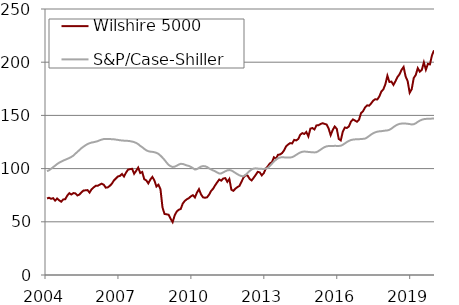
| Category | Wilshire 5000 | S&P/Case-Shiller Index |
|---|---|---|
| 2004.0 | 71.941 | 97.501 |
| 2004.0 | 72.587 | 98.418 |
| 2004.0 | 71.601 | 99.839 |
| 2004.0 | 72.224 | 101.294 |
| 2004.0 | 69.923 | 102.787 |
| 2004.0 | 71.889 | 104.3 |
| 2004.0 | 70.207 | 105.561 |
| 2004.0 | 68.888 | 106.584 |
| 2004.0 | 71.003 | 107.481 |
| 2004.0 | 71.267 | 108.306 |
| 2004.0 | 74.633 | 109.136 |
| 2004.0 | 76.897 | 109.949 |
| 2005.0 | 75.619 | 110.961 |
| 2005.0 | 76.978 | 112.204 |
| 2005.0 | 76.733 | 114.042 |
| 2005.0 | 74.734 | 115.721 |
| 2005.0 | 75.647 | 117.484 |
| 2005.0 | 77.666 | 119.197 |
| 2005.0 | 79.436 | 120.64 |
| 2005.0 | 79.562 | 121.905 |
| 2005.0 | 79.785 | 123.074 |
| 2005.0 | 77.477 | 123.864 |
| 2005.0 | 80.553 | 124.503 |
| 2005.0 | 82.276 | 124.804 |
| 2006.0 | 83.772 | 125.304 |
| 2006.0 | 83.796 | 125.769 |
| 2006.0 | 84.947 | 126.635 |
| 2006.0 | 85.831 | 127.258 |
| 2006.0 | 84.875 | 127.765 |
| 2006.0 | 82.088 | 127.881 |
| 2006.0 | 82.374 | 127.922 |
| 2006.0 | 83.797 | 127.781 |
| 2006.0 | 85.784 | 127.639 |
| 2006.0 | 88.804 | 127.539 |
| 2006.0 | 90.71 | 127.247 |
| 2006.0 | 92.617 | 126.968 |
| 2007.0 | 93.134 | 126.614 |
| 2007.0 | 94.961 | 126.443 |
| 2007.0 | 92.525 | 126.25 |
| 2007.0 | 96.251 | 126.206 |
| 2007.0 | 99.072 | 126.035 |
| 2007.0 | 99.469 | 125.797 |
| 2007.0 | 99.834 | 125.418 |
| 2007.0 | 95.13 | 124.892 |
| 2007.0 | 97.895 | 124.121 |
| 2007.0 | 100.939 | 123.017 |
| 2007.0 | 95.877 | 121.377 |
| 2007.0 | 96.811 | 120.113 |
| 2008.0 | 89.999 | 118.547 |
| 2008.0 | 88.917 | 117.24 |
| 2008.0 | 86.123 | 116.349 |
| 2008.0 | 89.722 | 115.947 |
| 2008.0 | 92.182 | 115.737 |
| 2008.0 | 88.888 | 115.401 |
| 2008.0 | 83.152 | 114.83 |
| 2008.0 | 84.871 | 113.835 |
| 2008.0 | 80.628 | 112.196 |
| 2008.0 | 63.464 | 110.291 |
| 2008.0 | 57.38 | 108.148 |
| 2008.0 | 57.032 | 105.705 |
| 2009.0 | 56.688 | 103.499 |
| 2009.0 | 52.829 | 102.291 |
| 2009.0 | 49.665 | 101.527 |
| 2009.0 | 55.95 | 101.823 |
| 2009.0 | 59.614 | 102.673 |
| 2009.0 | 61.289 | 103.801 |
| 2009.0 | 62.023 | 104.46 |
| 2009.0 | 67.153 | 104.404 |
| 2009.0 | 69.65 | 103.682 |
| 2009.0 | 71.159 | 102.96 |
| 2009.0 | 72.206 | 102.513 |
| 2009.0 | 73.916 | 101.63 |
| 2010.0 | 75.04 | 100.479 |
| 2010.0 | 72.868 | 99.128 |
| 2010.0 | 77.409 | 99.505 |
| 2010.0 | 80.683 | 100.756 |
| 2010.0 | 75.869 | 101.89 |
| 2010.0 | 73.011 | 102.35 |
| 2010.0 | 72.57 | 102.253 |
| 2010.0 | 73.023 | 101.466 |
| 2010.0 | 75.502 | 100.206 |
| 2010.0 | 79.03 | 99.182 |
| 2010.0 | 81.126 | 98.275 |
| 2010.0 | 84.349 | 97.45 |
| 2011.0 | 87.107 | 96.348 |
| 2011.0 | 89.741 | 95.443 |
| 2011.0 | 88.689 | 95.48 |
| 2011.0 | 90.707 | 96.429 |
| 2011.0 | 91.015 | 97.492 |
| 2011.0 | 87.54 | 98.359 |
| 2011.0 | 90.235 | 98.635 |
| 2011.0 | 80.121 | 98.249 |
| 2011.0 | 79.132 | 97.129 |
| 2011.0 | 81.186 | 95.911 |
| 2011.0 | 82.654 | 94.702 |
| 2011.0 | 83.733 | 93.664 |
| 2012.0 | 87.74 | 92.971 |
| 2012.0 | 91.605 | 92.852 |
| 2012.0 | 93.808 | 94.146 |
| 2012.0 | 93.437 | 95.953 |
| 2012.0 | 90.332 | 97.738 |
| 2012.0 | 88.894 | 99.209 |
| 2012.0 | 91.376 | 99.981 |
| 2012.0 | 94.053 | 100.274 |
| 2012.0 | 96.987 | 100.033 |
| 2012.0 | 96.439 | 99.762 |
| 2012.0 | 93.664 | 99.757 |
| 2012.0 | 95.739 | 99.692 |
| 2013.0 | 100 | 100 |
| 2013.0 | 102.239 | 100.588 |
| 2013.0 | 104.879 | 102.528 |
| 2013.0 | 105.942 | 104.612 |
| 2013.0 | 110.638 | 106.616 |
| 2013.0 | 109.213 | 108.396 |
| 2013.0 | 112.964 | 109.685 |
| 2013.0 | 113.277 | 110.453 |
| 2013.0 | 114.577 | 110.646 |
| 2013.0 | 117.057 | 110.564 |
| 2013.0 | 120.946 | 110.429 |
| 2013.0 | 122.638 | 110.372 |
| 2014.0 | 123.937 | 110.434 |
| 2014.0 | 123.665 | 110.782 |
| 2014.0 | 126.984 | 111.695 |
| 2014.0 | 126.516 | 112.929 |
| 2014.0 | 127.812 | 114.117 |
| 2014.0 | 131.838 | 115.178 |
| 2014.0 | 133.335 | 115.818 |
| 2014.0 | 132.528 | 116.036 |
| 2014.0 | 134.37 | 115.891 |
| 2014.0 | 130.258 | 115.661 |
| 2014.0 | 137.595 | 115.486 |
| 2014.0 | 138.14 | 115.349 |
| 2015.0 | 136.759 | 115.203 |
| 2015.0 | 140.597 | 115.467 |
| 2015.0 | 140.761 | 116.477 |
| 2015.0 | 141.884 | 117.78 |
| 2015.0 | 142.635 | 119.082 |
| 2015.0 | 142.071 | 120.192 |
| 2015.0 | 141.415 | 120.916 |
| 2015.0 | 137.653 | 121.223 |
| 2015.0 | 131.414 | 121.297 |
| 2015.0 | 136.248 | 121.301 |
| 2015.0 | 139.575 | 121.366 |
| 2015.0 | 137.446 | 121.348 |
| 2016.0 | 127.864 | 121.293 |
| 2016.0 | 126.522 | 121.463 |
| 2016.0 | 134.831 | 122.377 |
| 2016.0 | 138.658 | 123.688 |
| 2016.0 | 138.178 | 124.968 |
| 2016.0 | 139.613 | 126.057 |
| 2016.0 | 144.092 | 126.822 |
| 2016.0 | 146.227 | 127.265 |
| 2016.0 | 145.178 | 127.465 |
| 2016.0 | 144.006 | 127.517 |
| 2016.0 | 145.978 | 127.664 |
| 2016.0 | 152.172 | 127.784 |
| 2017.0 | 154.006 | 127.958 |
| 2017.0 | 157.552 | 128.212 |
| 2017.0 | 159.444 | 129.258 |
| 2017.0 | 159.145 | 130.654 |
| 2017.0 | 161.275 | 132.039 |
| 2017.0 | 163.863 | 133.236 |
| 2017.0 | 165.189 | 134.1 |
| 2017.0 | 164.942 | 134.678 |
| 2017.0 | 167.737 | 135.003 |
| 2017.0 | 172.364 | 135.188 |
| 2017.0 | 174.497 | 135.441 |
| 2017.0 | 179.24 | 135.714 |
| 2018.0 | 187.255 | 135.9 |
| 2018.0 | 181.415 | 136.447 |
| 2018.0 | 181.766 | 137.603 |
| 2018.0 | 178.67 | 139.019 |
| 2018.0 | 182.178 | 140.293 |
| 2018.0 | 186.162 | 141.397 |
| 2018.0 | 188.619 | 142.027 |
| 2018.0 | 192.841 | 142.289 |
| 2018.0 | 195.528 | 142.321 |
| 2018.0 | 186.594 | 142.317 |
| 2018.0 | 182.251 | 142.135 |
| 2018.0 | 171.284 | 141.852 |
| 2019.0 | 174.593 | 141.509 |
| 2019.0 | 185.094 | 141.667 |
| 2019.0 | 188.001 | 142.601 |
| 2019.0 | 194.433 | 143.926 |
| 2019.0 | 191.064 | 145.078 |
| 2019.0 | 192.826 | 145.936 |
| 2019.0 | 199.822 | 146.458 |
| 2019.0 | 192.943 | 146.706 |
| 2019.0 | 198.39 | 146.829 |
| 2019.0 | 197.917 | 146.893 |
| 2019.0 | 206.408 | 146.988 |
| 2019.0 | 211.182 | 147.078 |